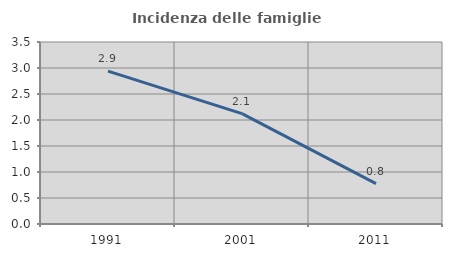
| Category | Incidenza delle famiglie numerose |
|---|---|
| 1991.0 | 2.941 |
| 2001.0 | 2.123 |
| 2011.0 | 0.775 |